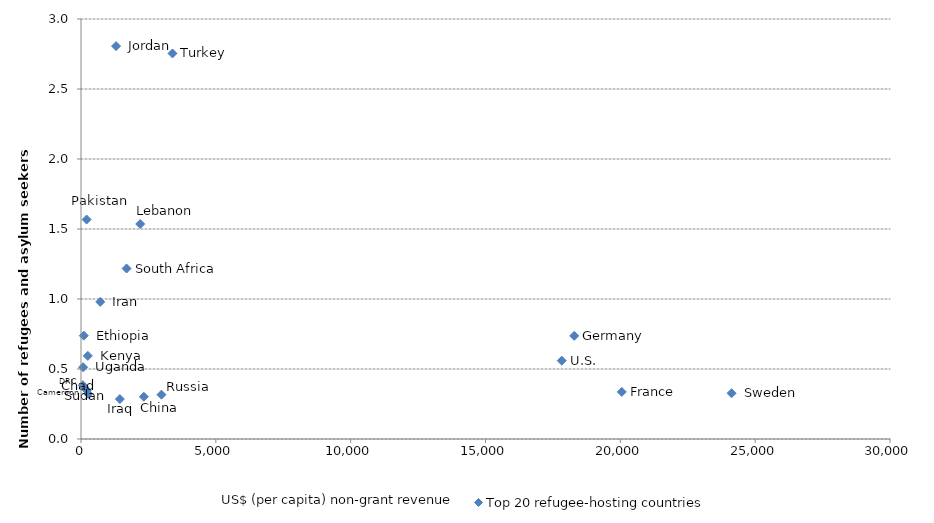
| Category | Top 20 refugee-hosting countries |
|---|---|
| 1300.872241553065 | 2806414 |
| 3392.847652608308 | 2753760 |
| 208.46526440777836 | 1567604 |
| 2196.6912120778766 | 1535662 |
| 1688.9371107787135 | 1217708 |
| 713.6348071840929 | 979479 |
| 103.46061105976746 | 738217 |
| 18289.910727859005 | 736740 |
| 254.00528880625328 | 593881 |
| 17828.53287147739 | 559370 |
| 78.24238437725838 | 512966 |
| 66.93330529604911 | 384078 |
| 101.06293630239303 | 372438 |
| 214.12181124289967 | 348346 |
| 20054.38772272401 | 336183 |
| 24124.240636299633 | 326566 |
| 267.72827885502426 | 322220 |
| 2983.388306753997 | 316594 |
| 2329.8560753812603 | 301729 |
| 1440.974279133932 | 285121 |